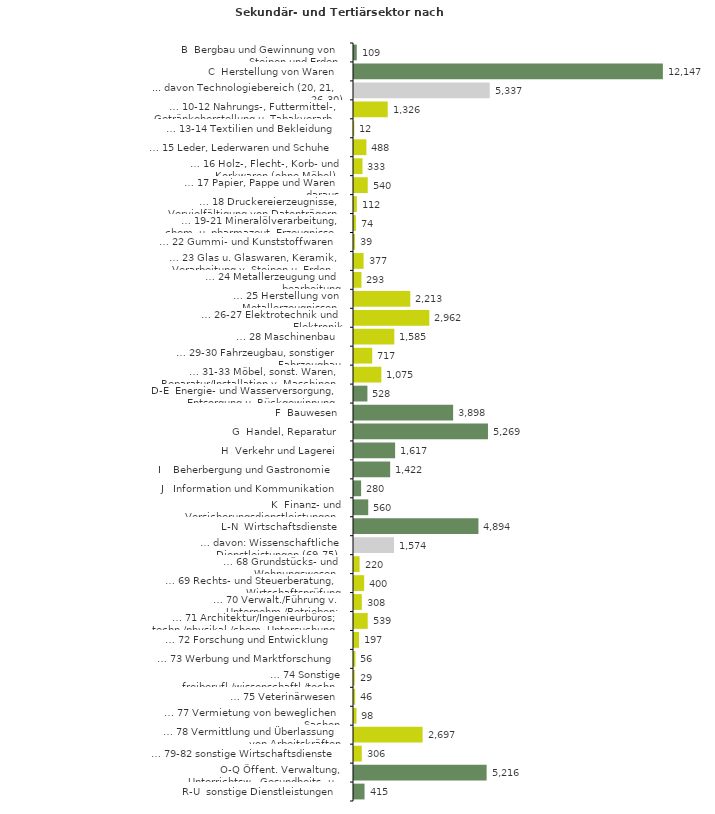
| Category | Series 0 |
|---|---|
| B  Bergbau und Gewinnung von Steinen und Erden | 109 |
| C  Herstellung von Waren | 12147 |
| ... davon Technologiebereich (20, 21, 26-30) | 5337 |
| … 10-12 Nahrungs-, Futtermittel-, Getränkeherstellung u. Tabakverarb. | 1326 |
| … 13-14 Textilien und Bekleidung | 12 |
| … 15 Leder, Lederwaren und Schuhe | 488 |
| … 16 Holz-, Flecht-, Korb- und Korkwaren (ohne Möbel)  | 333 |
| … 17 Papier, Pappe und Waren daraus  | 540 |
| … 18 Druckereierzeugnisse, Vervielfältigung von Datenträgern | 112 |
| … 19-21 Mineralölverarbeitung, chem. u. pharmazeut. Erzeugnisse | 74 |
| … 22 Gummi- und Kunststoffwaren | 39 |
| … 23 Glas u. Glaswaren, Keramik, Verarbeitung v. Steinen u. Erden  | 377 |
| … 24 Metallerzeugung und -bearbeitung | 293 |
| … 25 Herstellung von Metallerzeugnissen  | 2213 |
| … 26-27 Elektrotechnik und Elektronik | 2962 |
| … 28 Maschinenbau | 1585 |
| … 29-30 Fahrzeugbau, sonstiger Fahrzeugbau | 717 |
| … 31-33 Möbel, sonst. Waren, Reparatur/Installation v. Maschinen | 1075 |
| D-E  Energie- und Wasserversorgung, Entsorgung u. Rückgewinnung | 528 |
| F  Bauwesen | 3898 |
| G  Handel, Reparatur | 5269 |
| H  Verkehr und Lagerei | 1617 |
| I    Beherbergung und Gastronomie | 1422 |
| J   Information und Kommunikation | 280 |
| K  Finanz- und Versicherungsdienstleistungen | 560 |
| L-N  Wirtschaftsdienste | 4894 |
| … davon: Wissenschaftliche Dienstleistungen (69-75) | 1574 |
| … 68 Grundstücks- und Wohnungswesen  | 220 |
| … 69 Rechts- und Steuerberatung, Wirtschaftsprüfung | 400 |
| … 70 Verwalt./Führung v. Unternehm./Betrieben; Unternehmensberat. | 308 |
| … 71 Architektur/Ingenieurbüros; techn./physikal./chem. Untersuchung | 539 |
| … 72 Forschung und Entwicklung  | 197 |
| … 73 Werbung und Marktforschung | 56 |
| … 74 Sonstige freiberufl./wissenschaftl./techn. Tätigkeiten | 29 |
| … 75 Veterinärwesen | 46 |
| … 77 Vermietung von beweglichen Sachen  | 98 |
| … 78 Vermittlung und Überlassung von Arbeitskräften | 2697 |
| … 79-82 sonstige Wirtschaftsdienste | 306 |
| O-Q Öffent. Verwaltung, Unterrichtsw., Gesundheits- u. Sozialwesen | 5216 |
| R-U  sonstige Dienstleistungen | 415 |